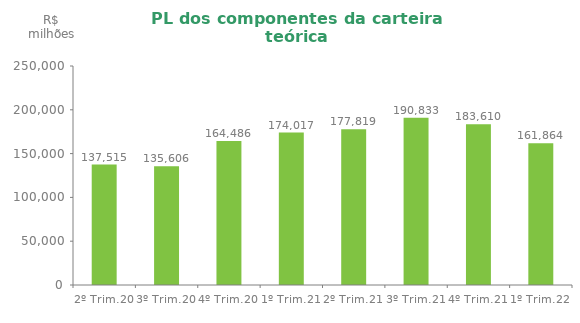
| Category | Series 0 |
|---|---|
| 2º Trim.20 | 137515.45 |
| 3º Trim.20 | 135605.88 |
| 4º Trim.20 | 164486.25 |
| 1º Trim.21 | 174016.57 |
| 2º Trim.21 | 177819.2 |
| 3º Trim.21 | 190833.2 |
| 4º Trim.21 | 183610.486 |
| 1º Trim.22 | 161864.31 |